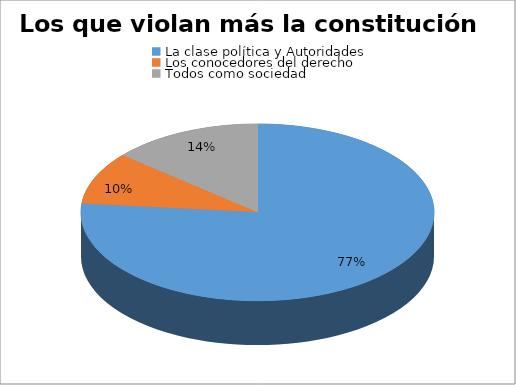
| Category | Series 0 |
|---|---|
| La clase política y Autoridades | 72 |
| Los conocedores del derecho | 9 |
| Todos como sociedad | 13 |